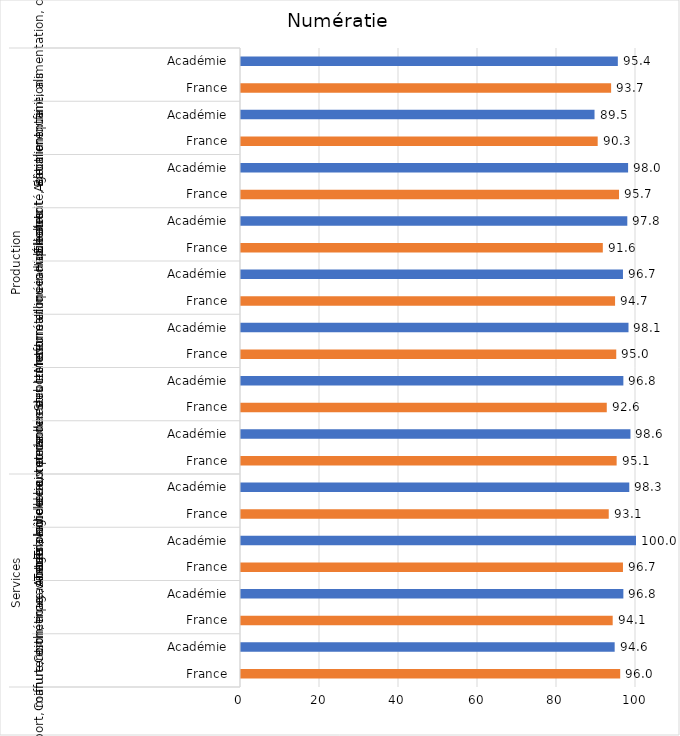
| Category | Series 0 |
|---|---|
| 0 | 96 |
| 1 | 94.6 |
| 2 | 94.1 |
| 3 | 96.8 |
| 4 | 96.7 |
| 5 | 100 |
| 6 | 93.1 |
| 7 | 98.3 |
| 8 | 95.1 |
| 9 | 98.6 |
| 10 | 92.6 |
| 11 | 96.8 |
| 12 | 95 |
| 13 | 98.1 |
| 14 | 94.7 |
| 15 | 96.7 |
| 16 | 91.6 |
| 17 | 97.8 |
| 18 | 95.7 |
| 19 | 98 |
| 20 | 90.3 |
| 21 | 89.5 |
| 22 | 93.7 |
| 23 | 95.4 |